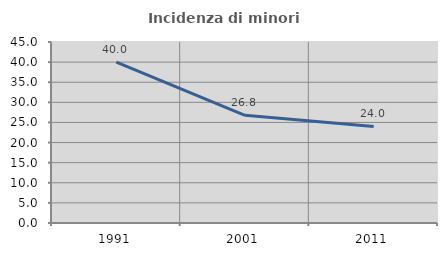
| Category | Incidenza di minori stranieri |
|---|---|
| 1991.0 | 40 |
| 2001.0 | 26.786 |
| 2011.0 | 24 |